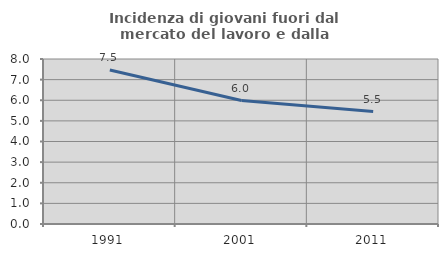
| Category | Incidenza di giovani fuori dal mercato del lavoro e dalla formazione  |
|---|---|
| 1991.0 | 7.47 |
| 2001.0 | 5.986 |
| 2011.0 | 5.452 |